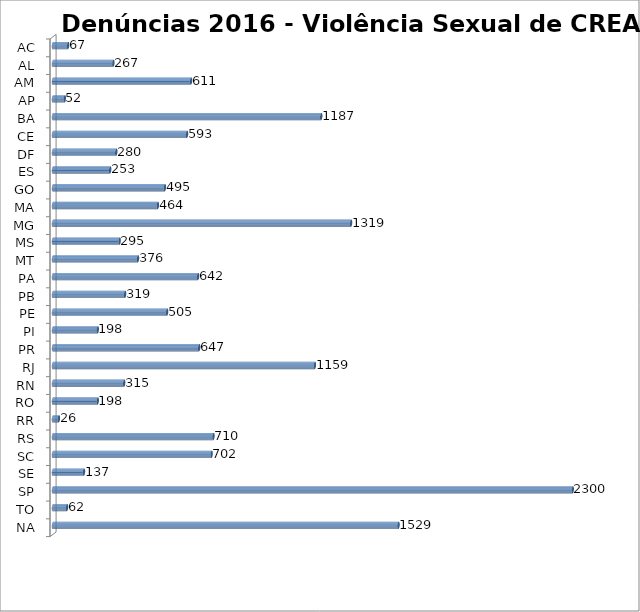
| Category | Series 0 |
|---|---|
| AC | 67 |
| AL | 267 |
| AM | 611 |
| AP | 52 |
| BA | 1187 |
| CE | 593 |
| DF | 280 |
| ES | 253 |
| GO | 495 |
| MA | 464 |
| MG | 1319 |
| MS | 295 |
| MT | 376 |
| PA | 642 |
| PB | 319 |
| PE | 505 |
| PI | 198 |
| PR | 647 |
| RJ | 1159 |
| RN | 315 |
| RO | 198 |
| RR | 26 |
| RS | 710 |
| SC | 702 |
| SE | 137 |
| SP | 2300 |
| TO | 62 |
| NA | 1529 |